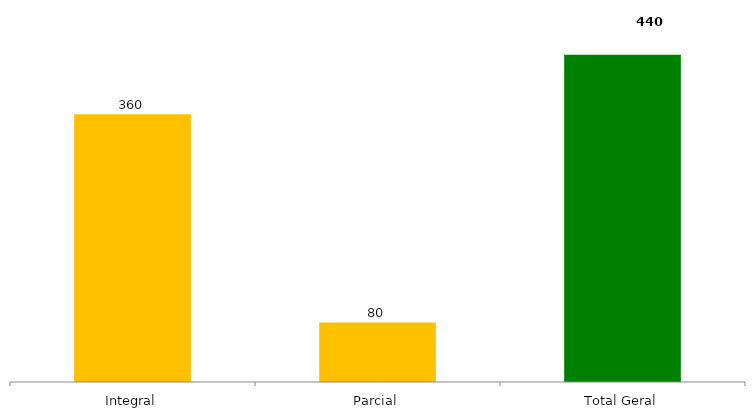
| Category | Categoria/Ano |
|---|---|
| Integral | 360 |
| Parcial | 80 |
| Total Geral | 440 |